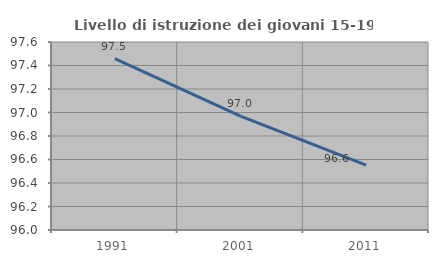
| Category | Livello di istruzione dei giovani 15-19 anni |
|---|---|
| 1991.0 | 97.458 |
| 2001.0 | 96.97 |
| 2011.0 | 96.552 |